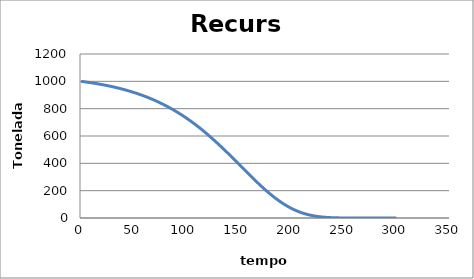
| Category | Series 0 |
|---|---|
| 1.0 | 1000 |
| 2.0 | 999 |
| 3.0 | 997.981 |
| 4.0 | 996.943 |
| 5.0 | 995.885 |
| 6.0 | 994.807 |
| 7.0 | 993.708 |
| 8.0 | 992.589 |
| 9.0 | 991.449 |
| 10.0 | 990.287 |
| 11.0 | 989.103 |
| 12.0 | 987.897 |
| 13.0 | 986.668 |
| 14.0 | 985.417 |
| 15.0 | 984.142 |
| 16.0 | 982.843 |
| 17.0 | 981.519 |
| 18.0 | 980.172 |
| 19.0 | 978.799 |
| 20.0 | 977.4 |
| 21.0 | 975.975 |
| 22.0 | 974.525 |
| 23.0 | 973.047 |
| 24.0 | 971.542 |
| 25.0 | 970.009 |
| 26.0 | 968.448 |
| 27.0 | 966.858 |
| 28.0 | 965.239 |
| 29.0 | 963.59 |
| 30.0 | 961.911 |
| 31.0 | 960.202 |
| 32.0 | 958.461 |
| 33.0 | 956.689 |
| 34.0 | 954.884 |
| 35.0 | 953.047 |
| 36.0 | 951.177 |
| 37.0 | 949.273 |
| 38.0 | 947.334 |
| 39.0 | 945.361 |
| 40.0 | 943.352 |
| 41.0 | 941.308 |
| 42.0 | 939.227 |
| 43.0 | 937.109 |
| 44.0 | 934.954 |
| 45.0 | 932.76 |
| 46.0 | 930.528 |
| 47.0 | 928.256 |
| 48.0 | 925.944 |
| 49.0 | 923.592 |
| 50.0 | 921.199 |
| 51.0 | 918.764 |
| 52.0 | 916.287 |
| 53.0 | 913.767 |
| 54.0 | 911.204 |
| 55.0 | 908.596 |
| 56.0 | 905.944 |
| 57.0 | 903.247 |
| 58.0 | 900.503 |
| 59.0 | 897.714 |
| 60.0 | 894.877 |
| 61.0 | 891.992 |
| 62.0 | 889.058 |
| 63.0 | 886.076 |
| 64.0 | 883.044 |
| 65.0 | 879.962 |
| 66.0 | 876.829 |
| 67.0 | 873.645 |
| 68.0 | 870.408 |
| 69.0 | 867.119 |
| 70.0 | 863.776 |
| 71.0 | 860.379 |
| 72.0 | 856.928 |
| 73.0 | 853.421 |
| 74.0 | 849.859 |
| 75.0 | 846.24 |
| 76.0 | 842.565 |
| 77.0 | 838.832 |
| 78.0 | 835.04 |
| 79.0 | 831.19 |
| 80.0 | 827.281 |
| 81.0 | 823.312 |
| 82.0 | 819.283 |
| 83.0 | 815.192 |
| 84.0 | 811.041 |
| 85.0 | 806.827 |
| 86.0 | 802.551 |
| 87.0 | 798.213 |
| 88.0 | 793.811 |
| 89.0 | 789.345 |
| 90.0 | 784.815 |
| 91.0 | 780.22 |
| 92.0 | 775.561 |
| 93.0 | 770.836 |
| 94.0 | 766.045 |
| 95.0 | 761.188 |
| 96.0 | 756.265 |
| 97.0 | 751.275 |
| 98.0 | 746.219 |
| 99.0 | 741.095 |
| 100.0 | 735.904 |
| 101.0 | 730.646 |
| 102.0 | 725.32 |
| 103.0 | 719.926 |
| 104.0 | 714.465 |
| 105.0 | 708.935 |
| 106.0 | 703.338 |
| 107.0 | 697.674 |
| 108.0 | 691.941 |
| 109.0 | 686.141 |
| 110.0 | 680.274 |
| 111.0 | 674.339 |
| 112.0 | 668.337 |
| 113.0 | 662.269 |
| 114.0 | 656.135 |
| 115.0 | 649.935 |
| 116.0 | 643.669 |
| 117.0 | 637.338 |
| 118.0 | 630.943 |
| 119.0 | 624.485 |
| 120.0 | 617.963 |
| 121.0 | 611.379 |
| 122.0 | 604.733 |
| 123.0 | 598.027 |
| 124.0 | 591.261 |
| 125.0 | 584.436 |
| 126.0 | 577.554 |
| 127.0 | 570.615 |
| 128.0 | 563.62 |
| 129.0 | 556.572 |
| 130.0 | 549.47 |
| 131.0 | 542.317 |
| 132.0 | 535.114 |
| 133.0 | 527.863 |
| 134.0 | 520.565 |
| 135.0 | 513.222 |
| 136.0 | 505.836 |
| 137.0 | 498.408 |
| 138.0 | 490.941 |
| 139.0 | 483.436 |
| 140.0 | 475.896 |
| 141.0 | 468.322 |
| 142.0 | 460.718 |
| 143.0 | 453.085 |
| 144.0 | 445.426 |
| 145.0 | 437.744 |
| 146.0 | 430.04 |
| 147.0 | 422.317 |
| 148.0 | 414.579 |
| 149.0 | 406.828 |
| 150.0 | 399.067 |
| 151.0 | 391.298 |
| 152.0 | 383.526 |
| 153.0 | 375.752 |
| 154.0 | 367.98 |
| 155.0 | 360.214 |
| 156.0 | 352.457 |
| 157.0 | 344.711 |
| 158.0 | 336.98 |
| 159.0 | 329.269 |
| 160.0 | 321.579 |
| 161.0 | 313.916 |
| 162.0 | 306.281 |
| 163.0 | 298.68 |
| 164.0 | 291.115 |
| 165.0 | 283.591 |
| 166.0 | 276.111 |
| 167.0 | 268.678 |
| 168.0 | 261.297 |
| 169.0 | 253.971 |
| 170.0 | 246.703 |
| 171.0 | 239.499 |
| 172.0 | 232.36 |
| 173.0 | 225.292 |
| 174.0 | 218.297 |
| 175.0 | 211.38 |
| 176.0 | 204.544 |
| 177.0 | 197.791 |
| 178.0 | 191.127 |
| 179.0 | 184.554 |
| 180.0 | 178.076 |
| 181.0 | 171.695 |
| 182.0 | 165.415 |
| 183.0 | 159.24 |
| 184.0 | 153.171 |
| 185.0 | 147.213 |
| 186.0 | 141.367 |
| 187.0 | 135.636 |
| 188.0 | 130.023 |
| 189.0 | 124.53 |
| 190.0 | 119.159 |
| 191.0 | 113.913 |
| 192.0 | 108.792 |
| 193.0 | 103.799 |
| 194.0 | 98.936 |
| 195.0 | 94.203 |
| 196.0 | 89.602 |
| 197.0 | 85.133 |
| 198.0 | 80.799 |
| 199.0 | 76.598 |
| 200.0 | 72.531 |
| 201.0 | 68.599 |
| 202.0 | 64.802 |
| 203.0 | 61.139 |
| 204.0 | 57.609 |
| 205.0 | 54.213 |
| 206.0 | 50.949 |
| 207.0 | 47.816 |
| 208.0 | 44.814 |
| 209.0 | 41.939 |
| 210.0 | 39.192 |
| 211.0 | 36.57 |
| 212.0 | 34.07 |
| 213.0 | 31.692 |
| 214.0 | 29.432 |
| 215.0 | 27.288 |
| 216.0 | 25.257 |
| 217.0 | 23.337 |
| 218.0 | 21.524 |
| 219.0 | 19.816 |
| 220.0 | 18.209 |
| 221.0 | 16.701 |
| 222.0 | 15.287 |
| 223.0 | 13.965 |
| 224.0 | 12.73 |
| 225.0 | 11.58 |
| 226.0 | 10.511 |
| 227.0 | 9.519 |
| 228.0 | 8.601 |
| 229.0 | 7.753 |
| 230.0 | 6.972 |
| 231.0 | 6.254 |
| 232.0 | 5.596 |
| 233.0 | 4.993 |
| 234.0 | 4.444 |
| 235.0 | 3.944 |
| 236.0 | 3.49 |
| 237.0 | 3.079 |
| 238.0 | 2.709 |
| 239.0 | 2.375 |
| 240.0 | 2.076 |
| 241.0 | 1.809 |
| 242.0 | 1.571 |
| 243.0 | 1.359 |
| 244.0 | 1.172 |
| 245.0 | 1.006 |
| 246.0 | 0.861 |
| 247.0 | 0.734 |
| 248.0 | 0.623 |
| 249.0 | 0.526 |
| 250.0 | 0.443 |
| 251.0 | 0.371 |
| 252.0 | 0.31 |
| 253.0 | 0.257 |
| 254.0 | 0.212 |
| 255.0 | 0.174 |
| 256.0 | 0.142 |
| 257.0 | 0.116 |
| 258.0 | 0.094 |
| 259.0 | 0.075 |
| 260.0 | 0.06 |
| 261.0 | 0.048 |
| 262.0 | 0.038 |
| 263.0 | 0.029 |
| 264.0 | 0.023 |
| 265.0 | 0.018 |
| 266.0 | 0.014 |
| 267.0 | 0.01 |
| 268.0 | 0.008 |
| 269.0 | 0.006 |
| 270.0 | 0.004 |
| 271.0 | 0.003 |
| 272.0 | 0.002 |
| 273.0 | 0.002 |
| 274.0 | 0.001 |
| 275.0 | 0.001 |
| 276.0 | 0.001 |
| 277.0 | 0 |
| 278.0 | 0 |
| 279.0 | 0 |
| 280.0 | 0 |
| 281.0 | 0 |
| 282.0 | 0 |
| 283.0 | 0 |
| 284.0 | 0 |
| 285.0 | 0 |
| 286.0 | 0 |
| 287.0 | 0 |
| 288.0 | 0 |
| 289.0 | 0 |
| 290.0 | 0 |
| 291.0 | 0 |
| 292.0 | 0 |
| 293.0 | 0 |
| 294.0 | 0 |
| 295.0 | 0 |
| 296.0 | 0 |
| 297.0 | 0 |
| 298.0 | 0 |
| 299.0 | 0 |
| 300.0 | 0 |